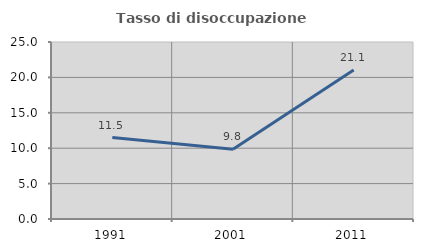
| Category | Tasso di disoccupazione giovanile  |
|---|---|
| 1991.0 | 11.499 |
| 2001.0 | 9.836 |
| 2011.0 | 21.053 |